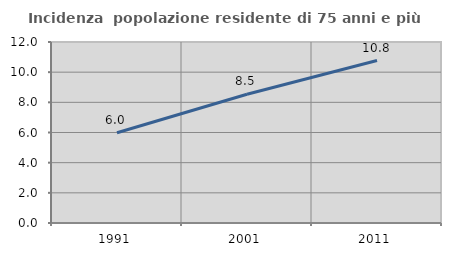
| Category | Incidenza  popolazione residente di 75 anni e più |
|---|---|
| 1991.0 | 5.982 |
| 2001.0 | 8.54 |
| 2011.0 | 10.772 |